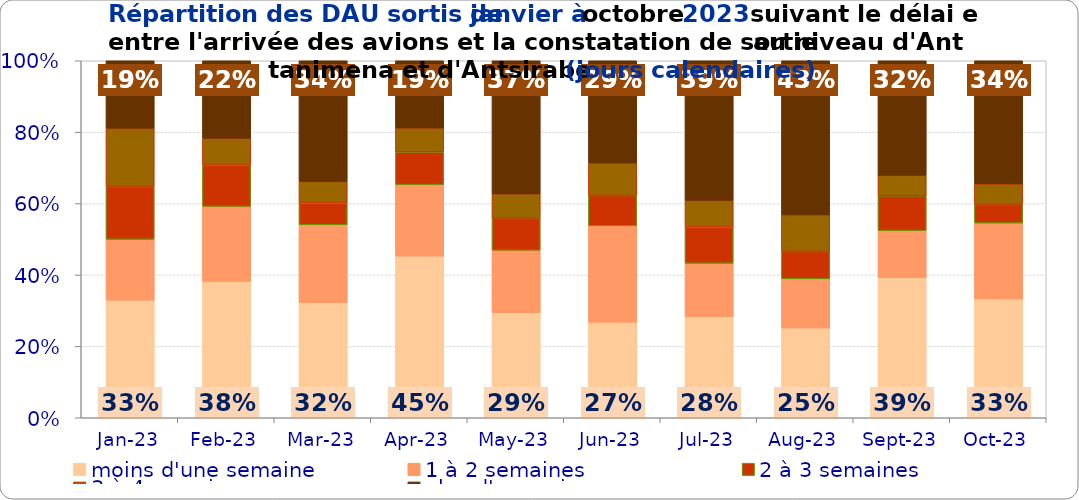
| Category | moins d'une semaine | 1 à 2 semaines | 2 à 3 semaines | 3 à 4 semaines | plus d'un mois |
|---|---|---|---|---|---|
| 2023-01-01 | 0.329 | 0.171 | 0.148 | 0.164 | 0.189 |
| 2023-02-01 | 0.382 | 0.21 | 0.116 | 0.075 | 0.217 |
| 2023-03-01 | 0.322 | 0.218 | 0.061 | 0.06 | 0.338 |
| 2023-04-01 | 0.453 | 0.2 | 0.092 | 0.067 | 0.188 |
| 2023-05-01 | 0.294 | 0.175 | 0.089 | 0.069 | 0.373 |
| 2023-06-01 | 0.268 | 0.27 | 0.085 | 0.091 | 0.286 |
| 2023-07-01 | 0.283 | 0.15 | 0.102 | 0.074 | 0.391 |
| 2023-08-01 | 0.251 | 0.138 | 0.077 | 0.102 | 0.432 |
| 2023-09-01 | 0.392 | 0.132 | 0.097 | 0.058 | 0.321 |
| 2023-10-01 | 0.333 | 0.213 | 0.052 | 0.058 | 0.345 |